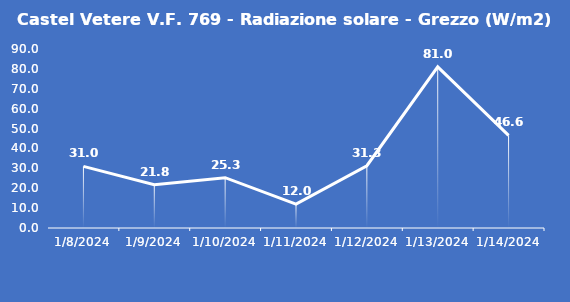
| Category | Castel Vetere V.F. 769 - Radiazione solare - Grezzo (W/m2) |
|---|---|
| 1/8/24 | 31 |
| 1/9/24 | 21.8 |
| 1/10/24 | 25.3 |
| 1/11/24 | 12 |
| 1/12/24 | 31.3 |
| 1/13/24 | 81 |
| 1/14/24 | 46.6 |